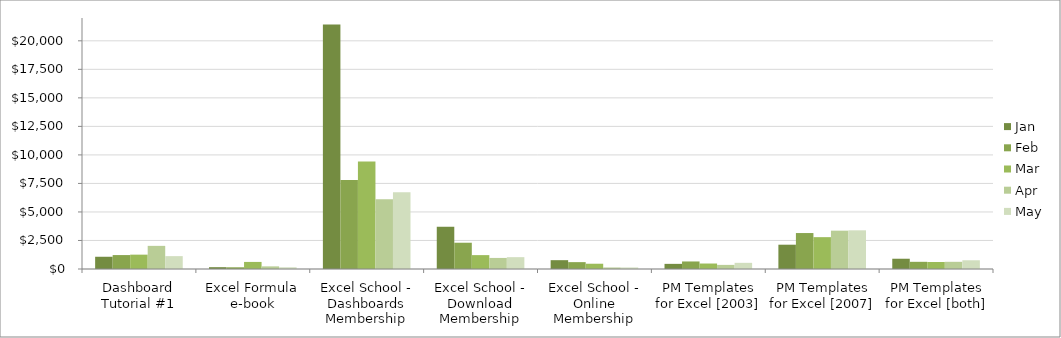
| Category | Jan | Feb | Mar | Apr | May |
|---|---|---|---|---|---|
| Dashboard Tutorial #1 | 1073 | 1221 | 1258 | 2027.6 | 1128 |
| Excel Formula e-book | 160 | 150 | 620 | 230 | 150 |
| Excel School - Dashboards Membership | 21422.1 | 7795.2 | 9414.84 | 6120.9 | 6718.6 |
| Excel School - Download Membership | 3702.75 | 2302.5 | 1216.6 | 970 | 1037.9 |
| Excel School - Online Membership | 774 | 602 | 462.3 | 134 | 134 |
| PM Templates for Excel [2003] | 450 | 660 | 480 | 360 | 540 |
| PM Templates for Excel [2007] | 2130 | 3151.47 | 2791.21 | 3360 | 3390 |
| PM Templates for Excel [both] | 900 | 630 | 615 | 630 | 765 |